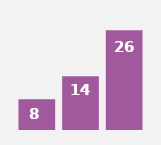
| Category | Series 0 |
|---|---|
| Data1 | 8 |
| Data2 | 14 |
| Data3 | 26 |